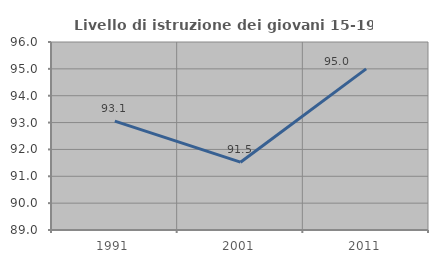
| Category | Livello di istruzione dei giovani 15-19 anni |
|---|---|
| 1991.0 | 93.056 |
| 2001.0 | 91.525 |
| 2011.0 | 95 |